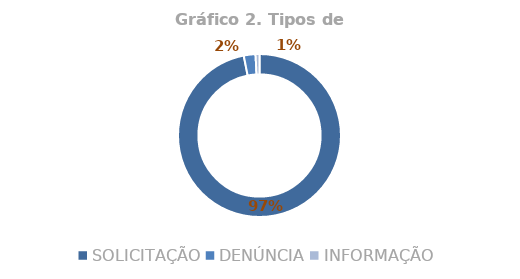
| Category | Total |
|---|---|
| SOLICITAÇÃO | 0.969 |
| DENÚNCIA | 0.023 |
| INFORMAÇÃO | 0.008 |